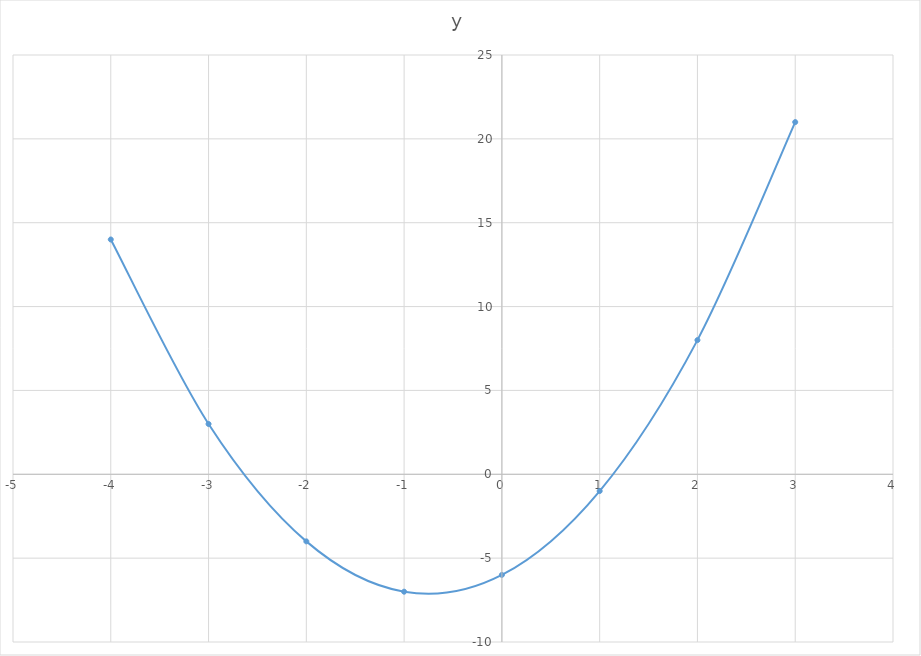
| Category | y |
|---|---|
| -4.0 | 14 |
| -3.0 | 3 |
| -2.0 | -4 |
| -1.0 | -7 |
| 0.0 | -6 |
| 1.0 | -1 |
| 2.0 | 8 |
| 3.0 | 21 |